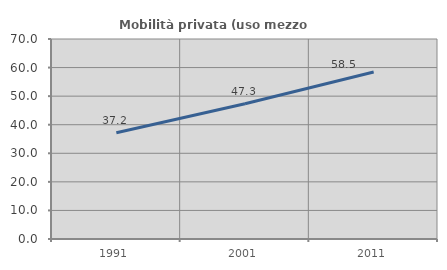
| Category | Mobilità privata (uso mezzo privato) |
|---|---|
| 1991.0 | 37.218 |
| 2001.0 | 47.347 |
| 2011.0 | 58.453 |